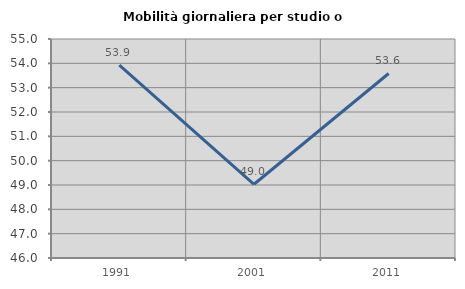
| Category | Mobilità giornaliera per studio o lavoro |
|---|---|
| 1991.0 | 53.928 |
| 2001.0 | 49.031 |
| 2011.0 | 53.582 |